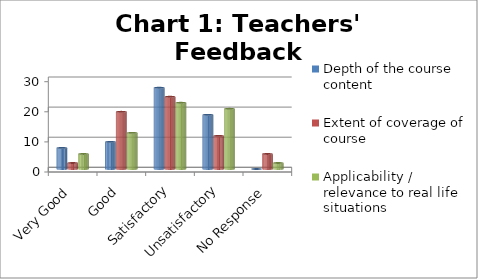
| Category | Depth of the course content | Extent of coverage of course | Applicability / relevance to real life situations |
|---|---|---|---|
| Very Good | 7 | 2 | 5 |
| Good | 9 | 19 | 12 |
| Satisfactory | 27 | 24 | 22 |
| Unsatisfactory | 18 | 11 | 20 |
| No Response | 0 | 5 | 2 |